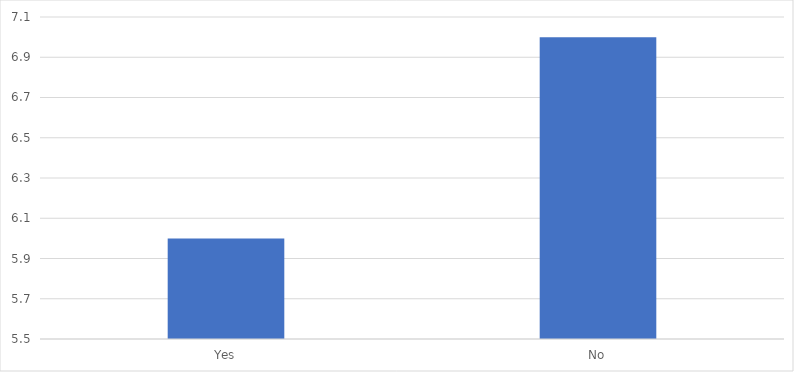
| Category | Number of Responses |
|---|---|
| Yes | 6 |
| No | 7 |